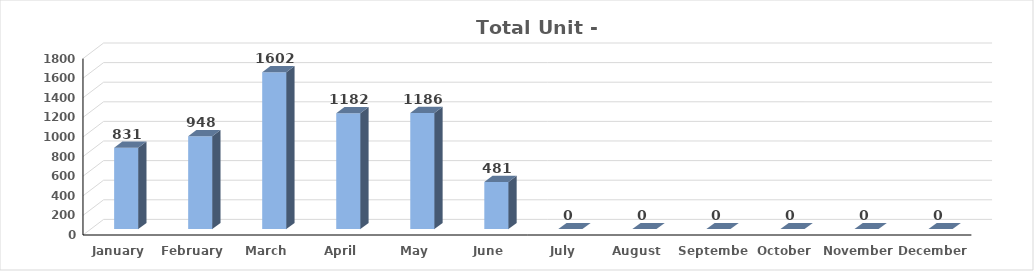
| Category | UNIT |
|---|---|
| January | 831 |
| February | 948 |
| March | 1602 |
| April | 1182 |
| May | 1186 |
| June | 481 |
| July | 0 |
| August | 0 |
| September | 0 |
| October | 0 |
| November | 0 |
| December | 0 |